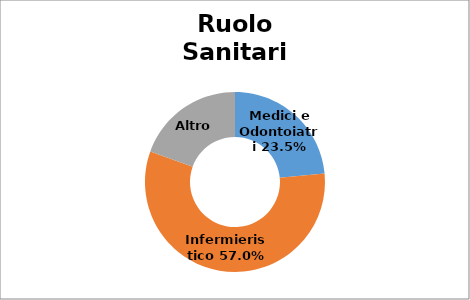
| Category | Series 0 |
|---|---|
| Medici e Odontoiatri | 0.235 |
| Infermieristico | 0.57 |
| Altro  | 0.195 |